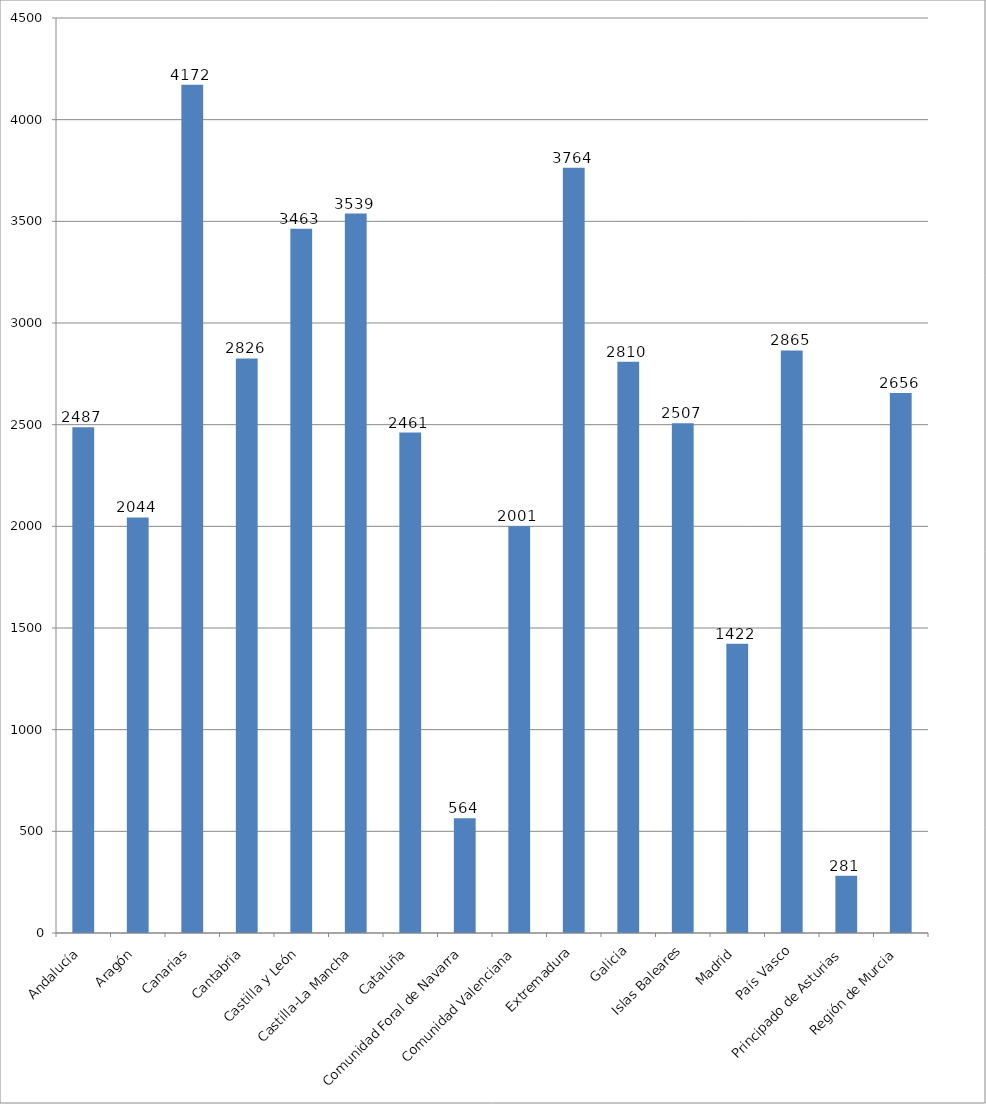
| Category | Total |
|---|---|
| Andalucía | 2486.75 |
| Aragón | 2044 |
| Canarias | 4172.2 |
| Cantabria | 2826 |
| Castilla y León | 3463.2 |
| Castilla-La Mancha | 3538.5 |
| Cataluña | 2461 |
| Comunidad Foral de Navarra | 564 |
| Comunidad Valenciana | 2001 |
| Extremadura | 3764 |
| Galicia | 2809.75 |
| Islas Baleares | 2507 |
| Madrid | 1422.273 |
| País Vasco | 2864.8 |
| Principado de Asturias | 281 |
| Región de Murcia | 2656 |